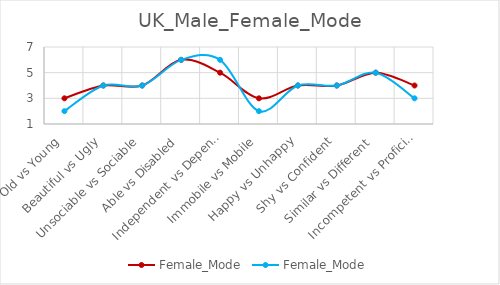
| Category | Female_Mode |
|---|---|
| Old vs Young | 2 |
|  Beautiful vs Ugly | 4 |
| Unsociable vs Sociable | 4 |
| Able vs Disabled | 6 |
| Independent vs Dependent | 6 |
| Immobile vs Mobile | 2 |
| Happy vs Unhappy | 4 |
| Shy vs Confident | 4 |
| Similar vs Different | 5 |
| Incompetent vs Proficient | 3 |